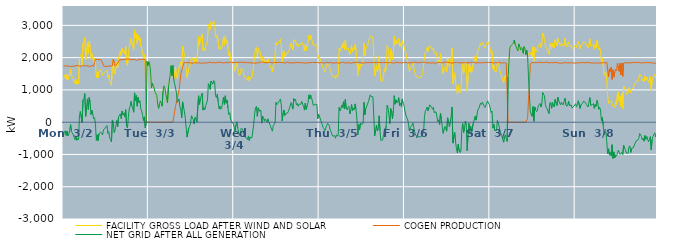
| Category | FACILITY GROSS LOAD AFTER WIND AND SOLAR | COGEN PRODUCTION | NET GRID AFTER ALL GENERATION |
|---|---|---|---|
|  Mon  3/2 | 1331 | 1738 | -407 |
|  Mon  3/2 | 1417 | 1740 | -323 |
|  Mon  3/2 | 1476 | 1741 | -265 |
|  Mon  3/2 | 1333 | 1743 | -410 |
|  Mon  3/2 | 1474 | 1748 | -274 |
|  Mon  3/2 | 1317 | 1745 | -428 |
|  Mon  3/2 | 1346 | 1734 | -388 |
|  Mon  3/2 | 1488 | 1741 | -253 |
|  Mon  3/2 | 1653 | 1727 | -74 |
|  Mon  3/2 | 1442 | 1733 | -291 |
|  Mon  3/2 | 1470 | 1734 | -264 |
|  Mon  3/2 | 1352 | 1737 | -385 |
|  Mon  3/2 | 1322 | 1729 | -407 |
|  Mon  3/2 | 1195 | 1737 | -542 |
|  Mon  3/2 | 1323 | 1753 | -430 |
|  Mon  3/2 | 1178 | 1741 | -563 |
|  Mon  3/2 | 1253 | 1758 | -505 |
|  Mon  3/2 | 1187 | 1736 | -549 |
|  Mon  3/2 | 1932 | 1736 | 196 |
|  Mon  3/2 | 2089 | 1755 | 334 |
|  Mon  3/2 | 2041 | 1733 | 308 |
|  Mon  3/2 | 1749 | 1755 | -6 |
|  Mon  3/2 | 2446 | 1753 | 693 |
|  Mon  3/2 | 2478 | 1753 | 725 |
|  Mon  3/2 | 2629 | 1744 | 885 |
|  Mon  3/2 | 1939 | 1758 | 181 |
|  Mon  3/2 | 2224 | 1750 | 474 |
|  Mon  3/2 | 2477 | 1753 | 724 |
|  Mon  3/2 | 2138 | 1742 | 396 |
|  Mon  3/2 | 2515 | 1753 | 762 |
|  Mon  3/2 | 2339 | 1719 | 620 |
|  Mon  3/2 | 1982 | 1747 | 235 |
|  Mon  3/2 | 2127 | 1761 | 366 |
|  Mon  3/2 | 1989 | 1745 | 244 |
|  Mon  3/2 | 1831 | 1726 | 105 |
|  Mon  3/2 | 1988 | 1851 | 137 |
|  Mon  3/2 | 1887 | 1953 | -66 |
|  Mon  3/2 | 1373 | 1937 | -564 |
|  Mon  3/2 | 1549 | 1938 | -389 |
|  Mon  3/2 | 1379 | 1949 | -570 |
|  Mon  3/2 | 1584 | 1937 | -353 |
|  Mon  3/2 | 1594 | 1946 | -352 |
|  Mon  3/2 | 1631 | 1939 | -308 |
|  Mon  3/2 | 1612 | 1948 | -336 |
|  Mon  3/2 | 1446 | 1841 | -395 |
|  Mon  3/2 | 1507 | 1748 | -241 |
|  Mon  3/2 | 1512 | 1744 | -232 |
|  Mon  3/2 | 1553 | 1734 | -181 |
|  Mon  3/2 | 1580 | 1734 | -154 |
|  Mon  3/2 | 1617 | 1721 | -104 |
|  Mon  3/2 | 1380 | 1730 | -350 |
|  Mon  3/2 | 1452 | 1743 | -291 |
|  Mon  3/2 | 1263 | 1746 | -483 |
|  Mon  3/2 | 1198 | 1738 | -540 |
|  Mon  3/2 | 1145 | 1754 | -609 |
|  Mon  3/2 | 1815 | 1746 | 69 |
|  Mon  3/2 | 1948 | 1957 | -9 |
|  Mon  3/2 | 1523 | 1843 | -320 |
|  Mon  3/2 | 1489 | 1741 | -252 |
|  Mon  3/2 | 1495 | 1746 | -251 |
|  Mon  3/2 | 1846 | 1793 | 53 |
|  Mon  3/2 | 1695 | 1833 | -138 |
|  Mon  3/2 | 2001 | 1833 | 168 |
|  Mon  3/2 | 2108 | 1931 | 177 |
|  Mon  3/2 | 2191 | 1934 | 257 |
|  Mon  3/2 | 2042 | 1932 | 110 |
|  Mon  3/2 | 2296 | 1949 | 347 |
|  Mon  3/2 | 2168 | 1937 | 231 |
|  Mon  3/2 | 2224 | 1934 | 290 |
|  Mon  3/2 | 2108 | 1947 | 161 |
|  Mon  3/2 | 2342 | 1955 | 387 |
|  Mon  3/2 | 1817 | 1945 | -128 |
|  Mon  3/2 | 1755 | 1935 | -180 |
|  Mon  3/2 | 2123 | 1969 | 154 |
|  Mon  3/2 | 2341 | 1932 | 409 |
|  Mon  3/2 | 2442 | 1948 | 494 |
|  Mon  3/2 | 2595 | 1954 | 641 |
|  Mon  3/2 | 2443 | 1938 | 505 |
|  Mon  3/2 | 2348 | 1933 | 415 |
|  Mon  3/2 | 2253 | 1946 | 307 |
|  Mon  3/2 | 2861 | 1951 | 910 |
|  Mon  3/2 | 2620 | 1950 | 670 |
|  Mon  3/2 | 2745 | 1916 | 829 |
|  Mon  3/2 | 2435 | 1941 | 494 |
|  Mon  3/2 | 2700 | 1929 | 771 |
|  Mon  3/2 | 2538 | 1933 | 605 |
|  Mon  3/2 | 2614 | 1952 | 662 |
|  Mon  3/2 | 2353 | 1945 | 408 |
|  Mon  3/2 | 2287 | 1940 | 347 |
|  Mon  3/2 | 2155 | 1942 | 213 |
|  Mon  3/2 | 1994 | 1948 | 46 |
|  Mon  3/2 | 2101 | 1935 | 166 |
|  Mon  3/2 | 1763 | 1935 | -172 |
|  Mon  3/2 | -44 | 0 | -44 |
|  Mon  3/2 | 1880 | 0 | 1880 |
|  Mon  3/2 | 1756 | 0 | 1756 |
|  Tue  3/3 | 1872 | 0 | 1872 |
|  Tue  3/3 | 1809 | 0 | 1809 |
|  Tue  3/3 | 1559 | 0 | 1559 |
|  Tue  3/3 | 1065 | 0 | 1065 |
|  Tue  3/3 | 1210 | 0 | 1210 |
|  Tue  3/3 | 1136 | 0 | 1136 |
|  Tue  3/3 | 1061 | 0 | 1061 |
|  Tue  3/3 | 934 | 0 | 934 |
|  Tue  3/3 | 905 | 0 | 905 |
|  Tue  3/3 | 830 | 0 | 830 |
|  Tue  3/3 | 540 | 0 | 540 |
|  Tue  3/3 | 425 | 0 | 425 |
|  Tue  3/3 | 573 | 0 | 573 |
|  Tue  3/3 | 663 | 0 | 663 |
|  Tue  3/3 | 647 | 0 | 647 |
|  Tue  3/3 | 496 | 0 | 496 |
|  Tue  3/3 | 960 | 0 | 960 |
|  Tue  3/3 | 1125 | 0 | 1125 |
|  Tue  3/3 | 1071 | 0 | 1071 |
|  Tue  3/3 | 884 | 0 | 884 |
|  Tue  3/3 | 911 | 0 | 911 |
|  Tue  3/3 | 601 | 0 | 601 |
|  Tue  3/3 | 1058 | 0 | 1058 |
|  Tue  3/3 | 1265 | 0 | 1265 |
|  Tue  3/3 | 1480 | 0 | 1480 |
|  Tue  3/3 | 1750 | 0 | 1750 |
|  Tue  3/3 | 1438 | 0 | 1438 |
|  Tue  3/3 | 1759 | 0 | 1759 |
|  Tue  3/3 | 1327 | 0 | 1327 |
|  Tue  3/3 | 1517 | 321 | 1196 |
|  Tue  3/3 | 1704 | 488 | 1216 |
|  Tue  3/3 | 1416 | 488 | 928 |
|  Tue  3/3 | 1346 | 732 | 614 |
|  Tue  3/3 | 1355 | 742 | 613 |
|  Tue  3/3 | 1710 | 991 | 719 |
|  Tue  3/3 | 1720 | 1238 | 482 |
|  Tue  3/3 | 1863 | 1485 | 378 |
|  Tue  3/3 | 1638 | 1508 | 130 |
|  Tue  3/3 | 2355 | 1725 | 630 |
|  Tue  3/3 | 2222 | 1747 | 475 |
|  Tue  3/3 | 2192 | 1854 | 338 |
|  Tue  3/3 | 1968 | 1844 | 124 |
|  Tue  3/3 | 1979 | 1843 | 136 |
|  Tue  3/3 | 1384 | 1848 | -464 |
|  Tue  3/3 | 1406 | 1847 | -441 |
|  Tue  3/3 | 1682 | 1854 | -172 |
|  Tue  3/3 | 1720 | 1843 | -123 |
|  Tue  3/3 | 1825 | 1844 | -19 |
|  Tue  3/3 | 2025 | 1828 | 197 |
|  Tue  3/3 | 1965 | 1846 | 119 |
|  Tue  3/3 | 1912 | 1831 | 81 |
|  Tue  3/3 | 1799 | 1857 | -58 |
|  Tue  3/3 | 1986 | 1841 | 145 |
|  Tue  3/3 | 1940 | 1843 | 97 |
|  Tue  3/3 | 1843 | 1842 | 1 |
|  Tue  3/3 | 1852 | 1847 | 5 |
|  Tue  3/3 | 2654 | 1835 | 819 |
|  Tue  3/3 | 2395 | 1841 | 554 |
|  Tue  3/3 | 2577 | 1845 | 732 |
|  Tue  3/3 | 2576 | 1814 | 762 |
|  Tue  3/3 | 2729 | 1836 | 893 |
|  Tue  3/3 | 2213 | 1839 | 374 |
|  Tue  3/3 | 2288 | 1838 | 450 |
|  Tue  3/3 | 2220 | 1833 | 387 |
|  Tue  3/3 | 2341 | 1836 | 505 |
|  Tue  3/3 | 2435 | 1839 | 596 |
|  Tue  3/3 | 2522 | 1834 | 688 |
|  Tue  3/3 | 3042 | 1846 | 1196 |
|  Tue  3/3 | 2993 | 1833 | 1160 |
|  Tue  3/3 | 2877 | 1862 | 1015 |
|  Tue  3/3 | 3115 | 1841 | 1274 |
|  Tue  3/3 | 3092 | 1831 | 1261 |
|  Tue  3/3 | 3037 | 1857 | 1180 |
|  Tue  3/3 | 3145 | 1855 | 1290 |
|  Tue  3/3 | 3088 | 1830 | 1258 |
|  Tue  3/3 | 2666 | 1838 | 828 |
|  Tue  3/3 | 2610 | 1845 | 765 |
|  Tue  3/3 | 2708 | 1846 | 862 |
|  Tue  3/3 | 2482 | 1843 | 639 |
|  Tue  3/3 | 2274 | 1858 | 416 |
|  Tue  3/3 | 2335 | 1842 | 493 |
|  Tue  3/3 | 2256 | 1856 | 400 |
|  Tue  3/3 | 2293 | 1838 | 455 |
|  Tue  3/3 | 2298 | 1838 | 460 |
|  Tue  3/3 | 2630 | 1854 | 776 |
|  Tue  3/3 | 2383 | 1833 | 550 |
|  Tue  3/3 | 2674 | 1855 | 819 |
|  Tue  3/3 | 2450 | 1860 | 590 |
|  Tue  3/3 | 2522 | 1838 | 684 |
|  Tue  3/3 | 2275 | 1837 | 438 |
|  Tue  3/3 | 2072 | 1835 | 237 |
|  Tue  3/3 | 2155 | 1862 | 293 |
|  Tue  3/3 | 1931 | 1833 | 98 |
|  Tue  3/3 | 1847 | 1858 | -11 |
|  Tue  3/3 | 1820 | 1846 | -26 |
|  Tue  3/3 | 1820 | 1848 | -28 |
|  Wed  3/4 | 1812 | 1852 | -40 |
|  Wed  3/4 | 1587 | 1858 | -271 |
|  Wed  3/4 | 1773 | 1846 | -73 |
|  Wed  3/4 | 1857 | 1847 | 10 |
|  Wed  3/4 | 1655 | 1829 | -174 |
|  Wed  3/4 | 1540 | 1851 | -311 |
|  Wed  3/4 | 1427 | 1840 | -413 |
|  Wed  3/4 | 1504 | 1855 | -351 |
|  Wed  3/4 | 1681 | 1862 | -181 |
|  Wed  3/4 | 1677 | 1856 | -179 |
|  Wed  3/4 | 1603 | 1849 | -246 |
|  Wed  3/4 | 1441 | 1856 | -415 |
|  Wed  3/4 | 1392 | 1845 | -453 |
|  Wed  3/4 | 1420 | 1854 | -434 |
|  Wed  3/4 | 1363 | 1851 | -488 |
|  Wed  3/4 | 1303 | 1844 | -541 |
|  Wed  3/4 | 1421 | 1847 | -426 |
|  Wed  3/4 | 1271 | 1839 | -568 |
|  Wed  3/4 | 1381 | 1846 | -465 |
|  Wed  3/4 | 1365 | 1842 | -477 |
|  Wed  3/4 | 1380 | 1862 | -482 |
|  Wed  3/4 | 1368 | 1829 | -461 |
|  Wed  3/4 | 1776 | 1843 | -67 |
|  Wed  3/4 | 2091 | 1828 | 263 |
|  Wed  3/4 | 2292 | 1847 | 445 |
|  Wed  3/4 | 2325 | 1836 | 489 |
|  Wed  3/4 | 2017 | 1836 | 181 |
|  Wed  3/4 | 2282 | 1836 | 446 |
|  Wed  3/4 | 2266 | 1827 | 439 |
|  Wed  3/4 | 2193 | 1858 | 335 |
|  Wed  3/4 | 2202 | 1831 | 371 |
|  Wed  3/4 | 1835 | 1865 | -30 |
|  Wed  3/4 | 2037 | 1849 | 188 |
|  Wed  3/4 | 1994 | 1856 | 138 |
|  Wed  3/4 | 1862 | 1832 | 30 |
|  Wed  3/4 | 1941 | 1838 | 103 |
|  Wed  3/4 | 1955 | 1832 | 123 |
|  Wed  3/4 | 1842 | 1845 | -3 |
|  Wed  3/4 | 1964 | 1857 | 107 |
|  Wed  3/4 | 1861 | 1848 | 13 |
|  Wed  3/4 | 1787 | 1850 | -63 |
|  Wed  3/4 | 1764 | 1854 | -90 |
|  Wed  3/4 | 1635 | 1849 | -214 |
|  Wed  3/4 | 1553 | 1833 | -280 |
|  Wed  3/4 | 1742 | 1843 | -101 |
|  Wed  3/4 | 1790 | 1849 | -59 |
|  Wed  3/4 | 1817 | 1840 | -23 |
|  Wed  3/4 | 2464 | 1849 | 615 |
|  Wed  3/4 | 2390 | 1844 | 546 |
|  Wed  3/4 | 2427 | 1849 | 578 |
|  Wed  3/4 | 2410 | 1838 | 572 |
|  Wed  3/4 | 2528 | 1856 | 672 |
|  Wed  3/4 | 2580 | 1860 | 720 |
|  Wed  3/4 | 2373 | 1839 | 534 |
|  Wed  3/4 | 1882 | 1846 | 36 |
|  Wed  3/4 | 2140 | 1852 | 288 |
|  Wed  3/4 | 2213 | 1834 | 379 |
|  Wed  3/4 | 2032 | 1827 | 205 |
|  Wed  3/4 | 2122 | 1848 | 274 |
|  Wed  3/4 | 2112 | 1853 | 259 |
|  Wed  3/4 | 2119 | 1836 | 283 |
|  Wed  3/4 | 2196 | 1863 | 333 |
|  Wed  3/4 | 2240 | 1828 | 412 |
|  Wed  3/4 | 2268 | 1847 | 421 |
|  Wed  3/4 | 2454 | 1845 | 609 |
|  Wed  3/4 | 2439 | 1857 | 582 |
|  Wed  3/4 | 2239 | 1833 | 406 |
|  Wed  3/4 | 2554 | 1826 | 728 |
|  Wed  3/4 | 2506 | 1838 | 668 |
|  Wed  3/4 | 2553 | 1847 | 706 |
|  Wed  3/4 | 2380 | 1847 | 533 |
|  Wed  3/4 | 2431 | 1854 | 577 |
|  Wed  3/4 | 2340 | 1849 | 491 |
|  Wed  3/4 | 2419 | 1857 | 562 |
|  Wed  3/4 | 2391 | 1843 | 548 |
|  Wed  3/4 | 2405 | 1850 | 555 |
|  Wed  3/4 | 2482 | 1839 | 643 |
|  Wed  3/4 | 2423 | 1859 | 564 |
|  Wed  3/4 | 2333 | 1843 | 490 |
|  Wed  3/4 | 2220 | 1846 | 374 |
|  Wed  3/4 | 2417 | 1825 | 592 |
|  Wed  3/4 | 2220 | 1825 | 395 |
|  Wed  3/4 | 2345 | 1837 | 508 |
|  Wed  3/4 | 2440 | 1839 | 601 |
|  Wed  3/4 | 2695 | 1847 | 848 |
|  Wed  3/4 | 2558 | 1840 | 718 |
|  Wed  3/4 | 2686 | 1841 | 845 |
|  Wed  3/4 | 2597 | 1837 | 760 |
|  Wed  3/4 | 2583 | 1849 | 734 |
|  Wed  3/4 | 2364 | 1847 | 517 |
|  Wed  3/4 | 2349 | 1847 | 502 |
|  Wed  3/4 | 2392 | 1840 | 552 |
|  Wed  3/4 | 2382 | 1847 | 535 |
|  Wed  3/4 | 2383 | 1832 | 551 |
|  Wed  3/4 | 1957 | 1850 | 107 |
|  Wed  3/4 | 2081 | 1837 | 244 |
|  Thu  3/5 | 2103 | 1830 | 273 |
|  Thu  3/5 | 1923 | 1826 | 97 |
|  Thu  3/5 | 1926 | 1850 | 76 |
|  Thu  3/5 | 1770 | 1847 | -77 |
|  Thu  3/5 | 1676 | 1836 | -160 |
|  Thu  3/5 | 1652 | 1853 | -201 |
|  Thu  3/5 | 1568 | 1834 | -266 |
|  Thu  3/5 | 1664 | 1852 | -188 |
|  Thu  3/5 | 1742 | 1855 | -113 |
|  Thu  3/5 | 1810 | 1845 | -35 |
|  Thu  3/5 | 1789 | 1836 | -47 |
|  Thu  3/5 | 1749 | 1851 | -102 |
|  Thu  3/5 | 1609 | 1853 | -244 |
|  Thu  3/5 | 1558 | 1847 | -289 |
|  Thu  3/5 | 1444 | 1833 | -389 |
|  Thu  3/5 | 1404 | 1839 | -435 |
|  Thu  3/5 | 1376 | 1831 | -455 |
|  Thu  3/5 | 1424 | 1841 | -417 |
|  Thu  3/5 | 1342 | 1840 | -498 |
|  Thu  3/5 | 1446 | 1835 | -389 |
|  Thu  3/5 | 1405 | 1840 | -435 |
|  Thu  3/5 | 1442 | 1831 | -389 |
|  Thu  3/5 | 2288 | 1830 | 458 |
|  Thu  3/5 | 2202 | 1854 | 348 |
|  Thu  3/5 | 2241 | 1834 | 407 |
|  Thu  3/5 | 2389 | 1857 | 532 |
|  Thu  3/5 | 2309 | 1861 | 448 |
|  Thu  3/5 | 2477 | 1844 | 633 |
|  Thu  3/5 | 2250 | 1843 | 407 |
|  Thu  3/5 | 2546 | 1845 | 701 |
|  Thu  3/5 | 2254 | 1834 | 420 |
|  Thu  3/5 | 2237 | 1851 | 386 |
|  Thu  3/5 | 2300 | 1843 | 457 |
|  Thu  3/5 | 2324 | 1833 | 491 |
|  Thu  3/5 | 2097 | 1843 | 254 |
|  Thu  3/5 | 2214 | 1855 | 359 |
|  Thu  3/5 | 2373 | 1824 | 549 |
|  Thu  3/5 | 2181 | 1833 | 348 |
|  Thu  3/5 | 2285 | 1852 | 433 |
|  Thu  3/5 | 2232 | 1846 | 386 |
|  Thu  3/5 | 2417 | 1850 | 567 |
|  Thu  3/5 | 2236 | 1832 | 404 |
|  Thu  3/5 | 1953 | 1854 | 99 |
|  Thu  3/5 | 1448 | 1838 | -390 |
|  Thu  3/5 | 1791 | 1860 | -69 |
|  Thu  3/5 | 1610 | 1850 | -240 |
|  Thu  3/5 | 1802 | 1840 | -38 |
|  Thu  3/5 | 1805 | 1839 | -34 |
|  Thu  3/5 | 1764 | 1832 | -68 |
|  Thu  3/5 | 1804 | 1828 | -24 |
|  Thu  3/5 | 2455 | 1836 | 619 |
|  Thu  3/5 | 2066 | 1833 | 233 |
|  Thu  3/5 | 2265 | 1842 | 423 |
|  Thu  3/5 | 2282 | 1855 | 427 |
|  Thu  3/5 | 2404 | 1842 | 562 |
|  Thu  3/5 | 2469 | 1829 | 640 |
|  Thu  3/5 | 2474 | 1849 | 625 |
|  Thu  3/5 | 2678 | 1832 | 846 |
|  Thu  3/5 | 2637 | 1843 | 794 |
|  Thu  3/5 | 2615 | 1824 | 791 |
|  Thu  3/5 | 2634 | 1845 | 789 |
|  Thu  3/5 | 2648 | 1848 | 800 |
|  Thu  3/5 | 1428 | 1849 | -421 |
|  Thu  3/5 | 1593 | 1843 | -250 |
|  Thu  3/5 | 1759 | 1847 | -88 |
|  Thu  3/5 | 1568 | 1843 | -275 |
|  Thu  3/5 | 1659 | 1852 | -193 |
|  Thu  3/5 | 2043 | 1845 | 198 |
|  Thu  3/5 | 1576 | 1843 | -267 |
|  Thu  3/5 | 1274 | 1840 | -566 |
|  Thu  3/5 | 1267 | 1847 | -580 |
|  Thu  3/5 | 1281 | 1830 | -549 |
|  Thu  3/5 | 1455 | 1846 | -391 |
|  Thu  3/5 | 1655 | 1859 | -204 |
|  Thu  3/5 | 1562 | 1844 | -282 |
|  Thu  3/5 | 1745 | 1841 | -96 |
|  Thu  3/5 | 2372 | 1847 | 525 |
|  Thu  3/5 | 2293 | 1849 | 444 |
|  Thu  3/5 | 2078 | 1839 | 239 |
|  Thu  3/5 | 1796 | 1842 | -46 |
|  Thu  3/5 | 2272 | 1849 | 423 |
|  Thu  3/5 | 2124 | 1828 | 296 |
|  Thu  3/5 | 1937 | 1834 | 103 |
|  Thu  3/5 | 2209 | 1847 | 362 |
|  Thu  3/5 | 2660 | 1840 | 820 |
|  Thu  3/5 | 2397 | 1841 | 556 |
|  Thu  3/5 | 2537 | 1844 | 693 |
|  Thu  3/5 | 2433 | 1831 | 602 |
|  Thu  3/5 | 2487 | 1854 | 633 |
|  Thu  3/5 | 2594 | 1834 | 760 |
|  Thu  3/5 | 2354 | 1838 | 516 |
|  Thu  3/5 | 2439 | 1845 | 594 |
|  Thu  3/5 | 2322 | 1836 | 486 |
|  Thu  3/5 | 2522 | 1812 | 710 |
|  Thu  3/5 | 2429 | 1843 | 586 |
|  Thu  3/5 | 2356 | 1843 | 513 |
|  Fri  3/6 | 2203 | 1859 | 344 |
|  Fri  3/6 | 2172 | 1836 | 336 |
|  Fri  3/6 | 1971 | 1841 | 130 |
|  Fri  3/6 | 1942 | 1843 | 99 |
|  Fri  3/6 | 1779 | 1838 | -59 |
|  Fri  3/6 | 1580 | 1849 | -269 |
|  Fri  3/6 | 1671 | 1843 | -172 |
|  Fri  3/6 | 1703 | 1845 | -142 |
|  Fri  3/6 | 1752 | 1840 | -88 |
|  Fri  3/6 | 1837 | 1862 | -25 |
|  Fri  3/6 | 1692 | 1859 | -167 |
|  Fri  3/6 | 1544 | 1836 | -292 |
|  Fri  3/6 | 1468 | 1864 | -396 |
|  Fri  3/6 | 1479 | 1848 | -369 |
|  Fri  3/6 | 1388 | 1842 | -454 |
|  Fri  3/6 | 1380 | 1840 | -460 |
|  Fri  3/6 | 1389 | 1841 | -452 |
|  Fri  3/6 | 1400 | 1858 | -458 |
|  Fri  3/6 | 1397 | 1853 | -456 |
|  Fri  3/6 | 1441 | 1842 | -401 |
|  Fri  3/6 | 1510 | 1857 | -347 |
|  Fri  3/6 | 1533 | 1837 | -304 |
|  Fri  3/6 | 2032 | 1860 | 172 |
|  Fri  3/6 | 2179 | 1837 | 342 |
|  Fri  3/6 | 2224 | 1835 | 389 |
|  Fri  3/6 | 2320 | 1849 | 471 |
|  Fri  3/6 | 2193 | 1842 | 351 |
|  Fri  3/6 | 2318 | 1871 | 447 |
|  Fri  3/6 | 2373 | 1834 | 539 |
|  Fri  3/6 | 2373 | 1845 | 528 |
|  Fri  3/6 | 2288 | 1830 | 458 |
|  Fri  3/6 | 2254 | 1853 | 401 |
|  Fri  3/6 | 2307 | 1844 | 463 |
|  Fri  3/6 | 2142 | 1850 | 292 |
|  Fri  3/6 | 2122 | 1821 | 301 |
|  Fri  3/6 | 2172 | 1851 | 321 |
|  Fri  3/6 | 2179 | 1843 | 336 |
|  Fri  3/6 | 1868 | 1848 | 20 |
|  Fri  3/6 | 1926 | 1852 | 74 |
|  Fri  3/6 | 1780 | 1857 | -77 |
|  Fri  3/6 | 2127 | 1850 | 277 |
|  Fri  3/6 | 1936 | 1844 | 92 |
|  Fri  3/6 | 1700 | 1833 | -133 |
|  Fri  3/6 | 1494 | 1839 | -345 |
|  Fri  3/6 | 1639 | 1859 | -220 |
|  Fri  3/6 | 1716 | 1847 | -131 |
|  Fri  3/6 | 1709 | 1857 | -148 |
|  Fri  3/6 | 1557 | 1836 | -279 |
|  Fri  3/6 | 1992 | 1858 | 134 |
|  Fri  3/6 | 1861 | 1832 | 29 |
|  Fri  3/6 | 1707 | 1847 | -140 |
|  Fri  3/6 | 1857 | 1846 | 11 |
|  Fri  3/6 | 1989 | 1828 | 161 |
|  Fri  3/6 | 2304 | 1833 | 471 |
|  Fri  3/6 | 1189 | 1837 | -648 |
|  Fri  3/6 | 1421 | 1831 | -410 |
|  Fri  3/6 | 1528 | 1844 | -316 |
|  Fri  3/6 | 1230 | 1848 | -618 |
|  Fri  3/6 | 1032 | 1856 | -824 |
|  Fri  3/6 | 876 | 1826 | -950 |
|  Fri  3/6 | 1154 | 1839 | -685 |
|  Fri  3/6 | 953 | 1843 | -890 |
|  Fri  3/6 | 899 | 1842 | -943 |
|  Fri  3/6 | 942 | 1838 | -896 |
|  Fri  3/6 | 1624 | 1842 | -218 |
|  Fri  3/6 | 1816 | 1859 | -43 |
|  Fri  3/6 | 1520 | 1839 | -319 |
|  Fri  3/6 | 1640 | 1845 | -205 |
|  Fri  3/6 | 1881 | 1846 | 35 |
|  Fri  3/6 | 1768 | 1857 | -89 |
|  Fri  3/6 | 962 | 1843 | -881 |
|  Fri  3/6 | 1425 | 1834 | -409 |
|  Fri  3/6 | 1804 | 1836 | -32 |
|  Fri  3/6 | 1552 | 1847 | -295 |
|  Fri  3/6 | 1723 | 1854 | -131 |
|  Fri  3/6 | 1540 | 1852 | -312 |
|  Fri  3/6 | 1569 | 1852 | -283 |
|  Fri  3/6 | 1826 | 1845 | -19 |
|  Fri  3/6 | 1805 | 1850 | -45 |
|  Fri  3/6 | 2041 | 1857 | 184 |
|  Fri  3/6 | 1891 | 1829 | 62 |
|  Fri  3/6 | 2070 | 1858 | 212 |
|  Fri  3/6 | 2220 | 1842 | 378 |
|  Fri  3/6 | 2261 | 1847 | 414 |
|  Fri  3/6 | 2235 | 1842 | 393 |
|  Fri  3/6 | 2440 | 1851 | 589 |
|  Fri  3/6 | 2381 | 1835 | 546 |
|  Fri  3/6 | 2471 | 1849 | 622 |
|  Fri  3/6 | 2419 | 1844 | 575 |
|  Fri  3/6 | 2348 | 1851 | 497 |
|  Fri  3/6 | 2303 | 1847 | 456 |
|  Fri  3/6 | 2321 | 1865 | 456 |
|  Fri  3/6 | 2440 | 1851 | 589 |
|  Fri  3/6 | 2507 | 1846 | 661 |
|  Fri  3/6 | 2448 | 1853 | 595 |
|  Fri  3/6 | 2382 | 1841 | 541 |
|  Sat  3/7 | 2394 | 1848 | 546 |
|  Sat  3/7 | 2134 | 1835 | 299 |
|  Sat  3/7 | 2199 | 1854 | 345 |
|  Sat  3/7 | 1666 | 1849 | -183 |
|  Sat  3/7 | 1756 | 1827 | -71 |
|  Sat  3/7 | 1582 | 1837 | -255 |
|  Sat  3/7 | 1591 | 1851 | -260 |
|  Sat  3/7 | 1576 | 1831 | -255 |
|  Sat  3/7 | 1889 | 1838 | 51 |
|  Sat  3/7 | 1794 | 1836 | -42 |
|  Sat  3/7 | 1736 | 1859 | -123 |
|  Sat  3/7 | 1563 | 1855 | -292 |
|  Sat  3/7 | 1481 | 1831 | -350 |
|  Sat  3/7 | 1411 | 1834 | -423 |
|  Sat  3/7 | 1299 | 1838 | -539 |
|  Sat  3/7 | 1214 | 1834 | -620 |
|  Sat  3/7 | 1386 | 1843 | -457 |
|  Sat  3/7 | 1451 | 1839 | -388 |
|  Sat  3/7 | 1319 | 1829 | -510 |
|  Sat  3/7 | 1261 | 1857 | -596 |
|  Sat  3/7 | 1401 | 0 | 1401 |
|  Sat  3/7 | 1376 | 0 | 1376 |
|  Sat  3/7 | 2302 | 0 | 2302 |
|  Sat  3/7 | 2363 | 0 | 2363 |
|  Sat  3/7 | 2347 | 0 | 2347 |
|  Sat  3/7 | 2416 | 0 | 2416 |
|  Sat  3/7 | 2462 | 0 | 2462 |
|  Sat  3/7 | 2547 | 0 | 2547 |
|  Sat  3/7 | 2414 | 0 | 2414 |
|  Sat  3/7 | 2343 | 0 | 2343 |
|  Sat  3/7 | 2270 | 0 | 2270 |
|  Sat  3/7 | 2209 | 0 | 2209 |
|  Sat  3/7 | 2425 | 0 | 2425 |
|  Sat  3/7 | 2353 | 0 | 2353 |
|  Sat  3/7 | 2233 | 0 | 2233 |
|  Sat  3/7 | 2314 | 0 | 2314 |
|  Sat  3/7 | 2280 | 0 | 2280 |
|  Sat  3/7 | 2135 | 0 | 2135 |
|  Sat  3/7 | 2343 | 0 | 2343 |
|  Sat  3/7 | 2288 | 0 | 2288 |
|  Sat  3/7 | 2093 | 0 | 2093 |
|  Sat  3/7 | 2230 | 0 | 2230 |
|  Sat  3/7 | 2175 | 129 | 2046 |
|  Sat  3/7 | 2089 | 700 | 1389 |
|  Sat  3/7 | 2062 | 1195 | 867 |
|  Sat  3/7 | 2103 | 1794 | 309 |
|  Sat  3/7 | 2173 | 1839 | 334 |
|  Sat  3/7 | 2026 | 1847 | 179 |
|  Sat  3/7 | 2333 | 1851 | 482 |
|  Sat  3/7 | 1890 | 1861 | 29 |
|  Sat  3/7 | 2314 | 1842 | 472 |
|  Sat  3/7 | 2218 | 1837 | 381 |
|  Sat  3/7 | 2176 | 1849 | 327 |
|  Sat  3/7 | 2201 | 1834 | 367 |
|  Sat  3/7 | 2348 | 1841 | 507 |
|  Sat  3/7 | 2346 | 1839 | 507 |
|  Sat  3/7 | 2457 | 1876 | 581 |
|  Sat  3/7 | 2306 | 1837 | 469 |
|  Sat  3/7 | 2417 | 1844 | 573 |
|  Sat  3/7 | 2761 | 1846 | 915 |
|  Sat  3/7 | 2693 | 1837 | 856 |
|  Sat  3/7 | 2670 | 1847 | 823 |
|  Sat  3/7 | 2380 | 1839 | 541 |
|  Sat  3/7 | 2308 | 1853 | 455 |
|  Sat  3/7 | 2247 | 1840 | 407 |
|  Sat  3/7 | 2271 | 1856 | 415 |
|  Sat  3/7 | 2105 | 1838 | 267 |
|  Sat  3/7 | 2412 | 1832 | 580 |
|  Sat  3/7 | 2457 | 1832 | 625 |
|  Sat  3/7 | 2281 | 1851 | 430 |
|  Sat  3/7 | 2449 | 1842 | 607 |
|  Sat  3/7 | 2472 | 1837 | 635 |
|  Sat  3/7 | 2300 | 1831 | 469 |
|  Sat  3/7 | 2557 | 1852 | 705 |
|  Sat  3/7 | 2449 | 1846 | 603 |
|  Sat  3/7 | 2364 | 1850 | 514 |
|  Sat  3/7 | 2601 | 1829 | 772 |
|  Sat  3/7 | 2499 | 1832 | 667 |
|  Sat  3/7 | 2526 | 1849 | 677 |
|  Sat  3/7 | 2360 | 1826 | 534 |
|  Sat  3/7 | 2468 | 1846 | 622 |
|  Sat  3/7 | 2395 | 1829 | 566 |
|  Sat  3/7 | 2379 | 1845 | 534 |
|  Sat  3/7 | 2350 | 1839 | 511 |
|  Sat  3/7 | 2603 | 1859 | 744 |
|  Sat  3/7 | 2397 | 1853 | 544 |
|  Sat  3/7 | 2338 | 1850 | 488 |
|  Sat  3/7 | 2367 | 1831 | 536 |
|  Sat  3/7 | 2489 | 1841 | 648 |
|  Sat  3/7 | 2350 | 1842 | 508 |
|  Sat  3/7 | 2330 | 1840 | 490 |
|  Sat  3/7 | 2370 | 1837 | 533 |
|  Sat  3/7 | 2285 | 1846 | 439 |
|  Sat  3/7 | 2257 | 1842 | 415 |
|  Sat  3/7 | 2323 | 1833 | 490 |
|  Sat  3/7 | 2341 | 1826 | 515 |
|  Sun  3/8 | 2406 | 1833 | 573 |
|  Sun  3/8 | 2312 | 1838 | 474 |
|  Sun  3/8 | 2412 | 1842 | 570 |
|  Sun  3/8 | 2501 | 1838 | 663 |
|  Sun  3/8 | 2495 | 1846 | 649 |
|  Sun  3/8 | 2268 | 1839 | 429 |
|  Sun  3/8 | 2389 | 1847 | 542 |
|  Sun  3/8 | 2387 | 1847 | 540 |
|  Sun  3/8 | 2424 | 1831 | 593 |
|  Sun  3/8 | 2491 | 1843 | 648 |
|  Sun  3/8 | 2483 | 1837 | 646 |
|  Sun  3/8 | 2453 | 1840 | 613 |
|  Sun  3/8 | 2386 | 1835 | 551 |
|  Sun  3/8 | 2352 | 1847 | 505 |
|  Sun  3/8 | 2298 | 1828 | 470 |
|  Sun  3/8 | 2304 | 1847 | 457 |
|  Sun  3/8 | 2583 | 1823 | 760 |
|  Sun  3/8 | 2355 | 1834 | 521 |
|  Sun  3/8 | 2357 | 1845 | 512 |
|  Sun  3/8 | 2378 | 1833 | 545 |
|  Sun  3/8 | 2414 | 1837 | 577 |
|  Sun  3/8 | 2263 | 1839 | 424 |
|  Sun  3/8 | 2403 | 1853 | 550 |
|  Sun  3/8 | 2307 | 1825 | 482 |
|  Sun  3/8 | 2528 | 1854 | 674 |
|  Sun  3/8 | 2417 | 1840 | 577 |
|  Sun  3/8 | 2254 | 1858 | 396 |
|  Sun  3/8 | 2299 | 1837 | 462 |
|  Sun  3/8 | 2210 | 1836 | 374 |
|  Sun  3/8 | 1879 | 1831 | 48 |
|  Sun  3/8 | 1993 | 1843 | 150 |
|  Sun  3/8 | 1763 | 1852 | -89 |
|  Sun  3/8 | 1454 | 1841 | -387 |
|  Sun  3/8 | 1443 | 1830 | -387 |
|  Sun  3/8 | 1557 | 1849 | -292 |
|  Sun  3/8 | 1262 | 1860 | -598 |
|  Sun  3/8 | 861 | 1841 | -980 |
|  Sun  3/8 | 580 | 1404 | -824 |
|  Sun  3/8 | 639 | 1650 | -1011 |
|  Sun  3/8 | 631 | 1561 | -930 |
|  Sun  3/8 | 650 | 1702 | -1052 |
|  Sun  3/8 | 625 | 1324 | -699 |
|  Sun  3/8 | 502 | 1627 | -1125 |
|  Sun  3/8 | 476 | 1396 | -920 |
|  Sun  3/8 | 455 | 1560 | -1105 |
|  Sun  3/8 | 634 | 1644 | -1010 |
|  Sun  3/8 | 534 | 1586 | -1052 |
|  Sun  3/8 | 866 | 1825 | -959 |
|  Sun  3/8 | 940 | 1806 | -866 |
|  Sun  3/8 | 644 | 1575 | -931 |
|  Sun  3/8 | 815 | 1818 | -1003 |
|  Sun  3/8 | 488 | 1463 | -975 |
|  Sun  3/8 | 902 | 1833 | -931 |
|  Sun  3/8 | 420 | 1421 | -1001 |
|  Sun  3/8 | 1114 | 1833 | -719 |
|  Sun  3/8 | 1039 | 1850 | -811 |
|  Sun  3/8 | 998 | 1852 | -854 |
|  Sun  3/8 | 855 | 1815 | -960 |
|  Sun  3/8 | 838 | 1804 | -966 |
|  Sun  3/8 | 895 | 1858 | -963 |
|  Sun  3/8 | 1067 | 1834 | -767 |
|  Sun  3/8 | 1097 | 1832 | -735 |
|  Sun  3/8 | 912 | 1851 | -939 |
|  Sun  3/8 | 1032 | 1842 | -810 |
|  Sun  3/8 | 1049 | 1835 | -786 |
|  Sun  3/8 | 1062 | 1853 | -791 |
|  Sun  3/8 | 1147 | 1856 | -709 |
|  Sun  3/8 | 1158 | 1840 | -682 |
|  Sun  3/8 | 1268 | 1846 | -578 |
|  Sun  3/8 | 1244 | 1849 | -605 |
|  Sun  3/8 | 1270 | 1825 | -555 |
|  Sun  3/8 | 1345 | 1850 | -505 |
|  Sun  3/8 | 1502 | 1853 | -351 |
|  Sun  3/8 | 1506 | 1841 | -335 |
|  Sun  3/8 | 1401 | 1841 | -440 |
|  Sun  3/8 | 1287 | 1832 | -545 |
|  Sun  3/8 | 1342 | 1840 | -498 |
|  Sun  3/8 | 1261 | 1850 | -589 |
|  Sun  3/8 | 1434 | 1848 | -414 |
|  Sun  3/8 | 1303 | 1833 | -530 |
|  Sun  3/8 | 1400 | 1843 | -443 |
|  Sun  3/8 | 1422 | 1854 | -432 |
|  Sun  3/8 | 1231 | 1842 | -611 |
|  Sun  3/8 | 1297 | 1840 | -543 |
|  Sun  3/8 | 1411 | 1859 | -448 |
|  Sun  3/8 | 988 | 1840 | -852 |
|  Sun  3/8 | 1314 | 1847 | -533 |
|  Sun  3/8 | 1399 | 1838 | -439 |
|  Sun  3/8 | 1397 | 1854 | -457 |
|  Sun  3/8 | 1487 | 1816 | -329 |
|  Sun  3/8 | 1376 | 1834 | -458 |
|  Sun  3/8 | 1472 | 1838 | -366 |